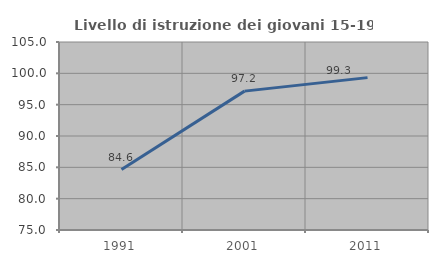
| Category | Livello di istruzione dei giovani 15-19 anni |
|---|---|
| 1991.0 | 84.642 |
| 2001.0 | 97.162 |
| 2011.0 | 99.314 |